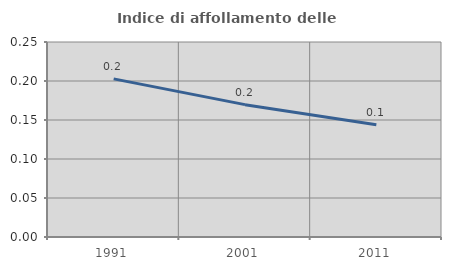
| Category | Indice di affollamento delle abitazioni  |
|---|---|
| 1991.0 | 0.203 |
| 2001.0 | 0.17 |
| 2011.0 | 0.144 |